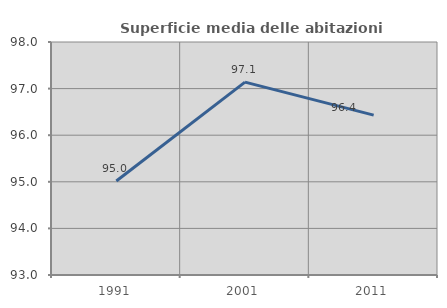
| Category | Superficie media delle abitazioni occupate |
|---|---|
| 1991.0 | 95.019 |
| 2001.0 | 97.139 |
| 2011.0 | 96.432 |